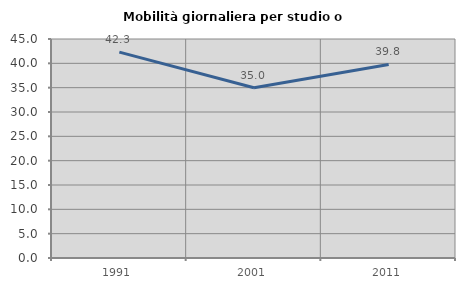
| Category | Mobilità giornaliera per studio o lavoro |
|---|---|
| 1991.0 | 42.308 |
| 2001.0 | 34.979 |
| 2011.0 | 39.766 |